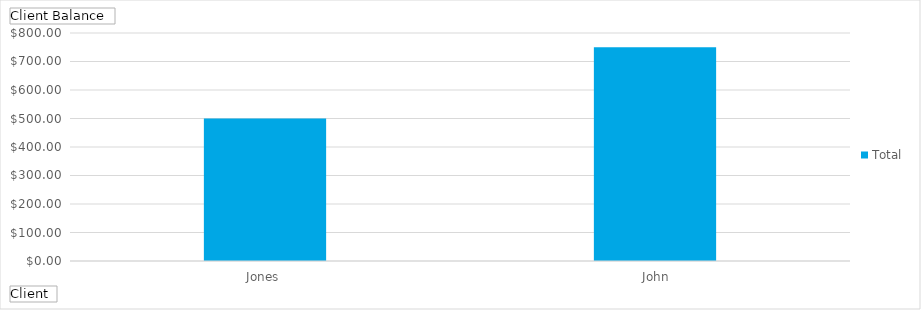
| Category | Total |
|---|---|
| Jones, John | 500 |
| Smith, Jane | 750 |